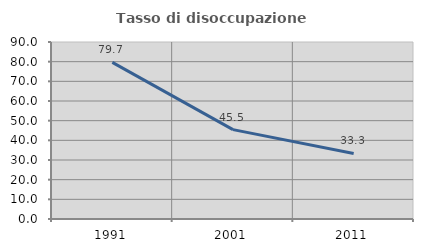
| Category | Tasso di disoccupazione giovanile  |
|---|---|
| 1991.0 | 79.661 |
| 2001.0 | 45.455 |
| 2011.0 | 33.333 |